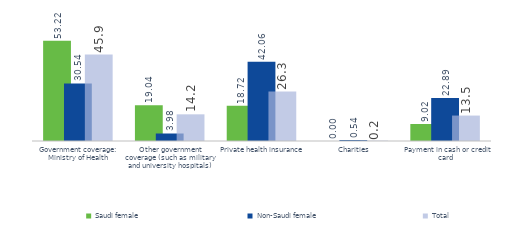
| Category | Saudi female  | Non-Saudi female | Total |
|---|---|---|---|
| Government coverage: Ministry of Health | 53.218 | 30.536 | 45.873 |
| Other government coverage (such as military and university hospitals) | 19.041 | 3.984 | 14.165 |
| Private health insurance | 18.721 | 42.057 | 26.278 |
| Charities | 0 | 0.535 | 0.173 |
|  Payment in cash or credit card | 9.02 | 22.889 | 13.511 |